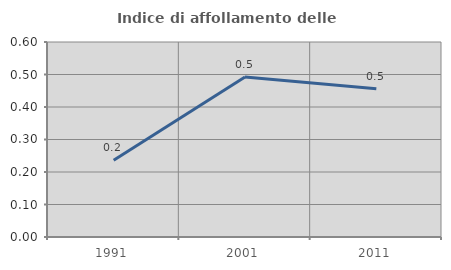
| Category | Indice di affollamento delle abitazioni  |
|---|---|
| 1991.0 | 0.236 |
| 2001.0 | 0.493 |
| 2011.0 | 0.456 |